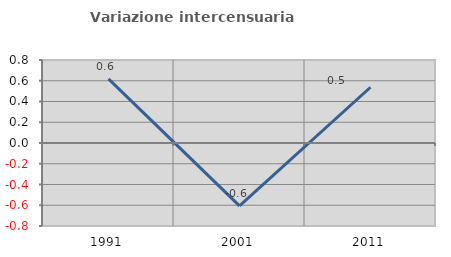
| Category | Variazione intercensuaria annua |
|---|---|
| 1991.0 | 0.618 |
| 2001.0 | -0.605 |
| 2011.0 | 0.537 |